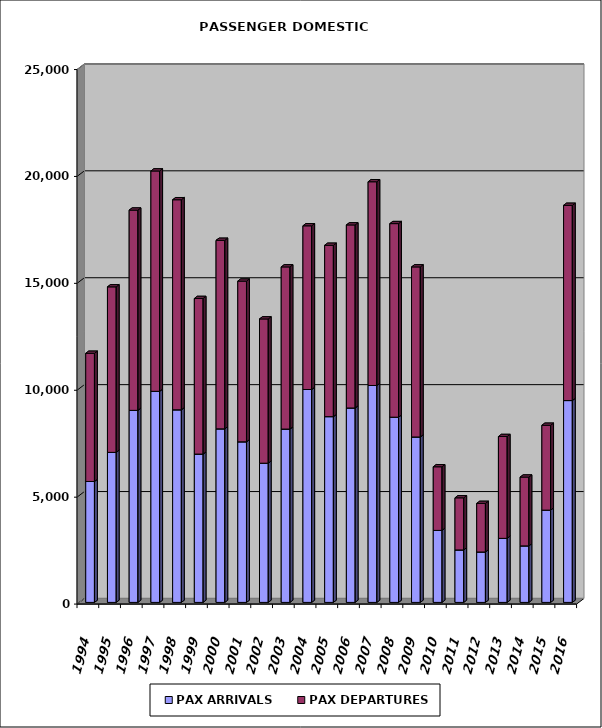
| Category | PAX ARRIVALS | PAX DEPARTURES |
|---|---|---|
| 1994.0 | 5655 | 5995 |
| 1995.0 | 7017 | 7741 |
| 1996.0 | 8982 | 9365 |
| 1997.0 | 9872 | 10305 |
| 1998.0 | 9007 | 9825 |
| 1999.0 | 6937 | 7276 |
| 2000.0 | 8116 | 8817 |
| 2001.0 | 7510 | 7515 |
| 2002.0 | 6510 | 6747 |
| 2003.0 | 8107 | 7583 |
| 2004.0 | 9957 | 7656 |
| 2005.0 | 8688 | 8013 |
| 2006.0 | 9093 | 8561 |
| 2007.0 | 10145 | 9528 |
| 2008.0 | 8662 | 9053 |
| 2009.0 | 7737 | 7953 |
| 2010.0 | 3367 | 2976 |
| 2011.0 | 2453 | 2438 |
| 2012.0 | 2358 | 2271 |
| 2013.0 | 2995 | 4763 |
| 2014.0 | 2643 | 3218 |
| 2015.0 | 4315 | 3969 |
| 2016.0 | 9440 | 9130 |